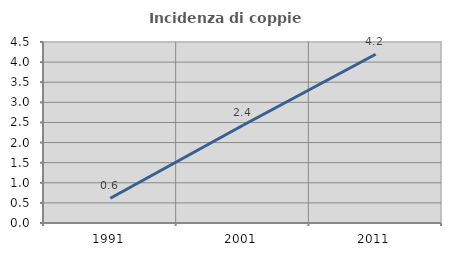
| Category | Incidenza di coppie miste |
|---|---|
| 1991.0 | 0.615 |
| 2001.0 | 2.431 |
| 2011.0 | 4.195 |